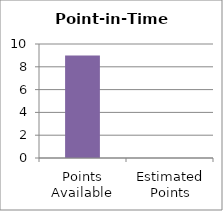
| Category | Point-in-Time Count |
|---|---|
| Points Available | 9 |
| Estimated Points | 0 |